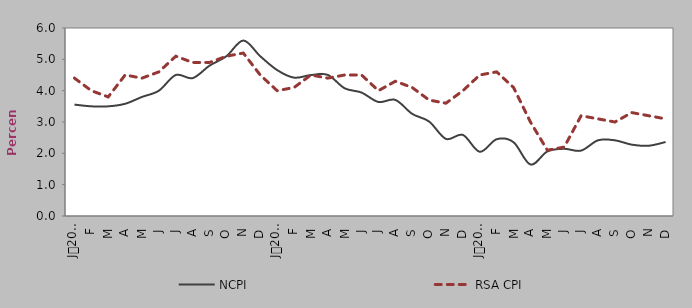
| Category | NCPI | RSA CPI |
|---|---|---|
| 0 | 3.555 | 4.4 |
| 1900-01-01 | 3.5 | 4 |
| 1900-01-02 | 3.5 | 3.8 |
| 1900-01-03 | 3.581 | 4.5 |
| 1900-01-04 | 3.8 | 4.4 |
| 1900-01-05 | 4 | 4.6 |
| 1900-01-06 | 4.5 | 5.1 |
| 1900-01-07 | 4.4 | 4.9 |
| 1900-01-08 | 4.8 | 4.9 |
| 1900-01-09 | 5.1 | 5.1 |
| 1900-01-10 | 5.6 | 5.2 |
| 1900-01-11 | 5.1 | 4.5 |
| 1900-01-12 | 4.658 | 4 |
| 1900-01-13 | 4.416 | 4.1 |
| 1900-01-14 | 4.498 | 4.5 |
| 1900-01-15 | 4.503 | 4.4 |
| 1900-01-16 | 4.076 | 4.5 |
| 1900-01-17 | 3.939 | 4.5 |
| 1900-01-18 | 3.639 | 4 |
| 1900-01-19 | 3.705 | 4.3 |
| 1900-01-20 | 3.259 | 4.1 |
| 1900-01-21 | 3.015 | 3.7 |
| 1900-01-22 | 2.461 | 3.6 |
| 1900-01-23 | 2.588 | 4 |
| 1900-01-24 | 2.05 | 4.5 |
| 1900-01-25 | 2.45 | 4.6 |
| 1900-01-26 | 2.354 | 4.1 |
| 1900-01-27 | 1.643 | 3 |
| 1900-01-28 | 2.06 | 2.1 |
| 1900-01-29 | 2.145 | 2.2 |
| 1900-01-30 | 2.087 | 3.2 |
| 1900-01-31 | 2.416 | 3.1 |
| 1900-02-01 | 2.416 | 3 |
| 1900-02-02 | 2.277 | 3.3 |
| 1900-02-03 | 2.242 | 3.2 |
| 1900-02-04 | 2.361 | 3.1 |